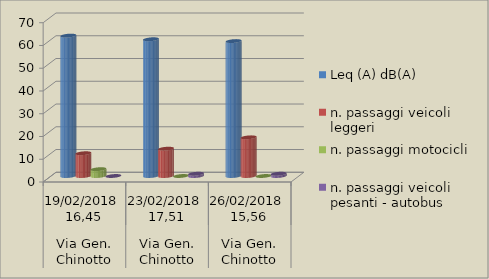
| Category | Leq (A) dB(A) | n. passaggi veicoli leggeri  | n. passaggi motocicli | n. passaggi veicoli pesanti - autobus  |
|---|---|---|---|---|
| 0 | 61.7 | 10 | 3 | 0 |
| 1 | 60.1 | 12 | 0 | 1 |
| 2 | 59.3 | 17 | 0 | 1 |